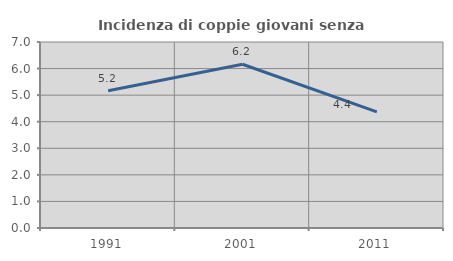
| Category | Incidenza di coppie giovani senza figli |
|---|---|
| 1991.0 | 5.169 |
| 2001.0 | 6.163 |
| 2011.0 | 4.372 |